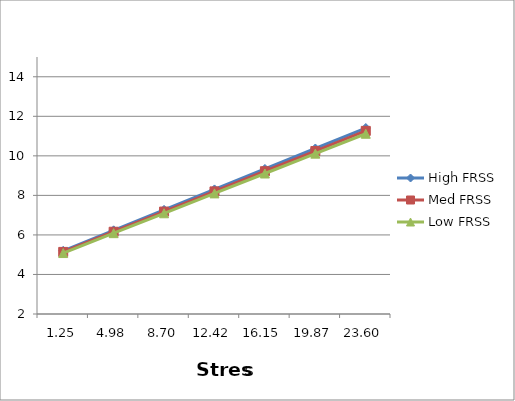
| Category | High FRSS | Med FRSS | Low FRSS |
|---|---|---|---|
| 1.251999999999999 | 5.197 | 5.14 | 5.083 |
| 4.975999999999999 | 6.232 | 6.161 | 6.089 |
| 8.7 | 7.267 | 7.181 | 7.095 |
| 12.424 | 8.302 | 8.201 | 8.101 |
| 16.148 | 9.337 | 9.222 | 9.106 |
| 19.872 | 10.372 | 10.242 | 10.112 |
| 23.596 | 11.407 | 11.263 | 11.118 |